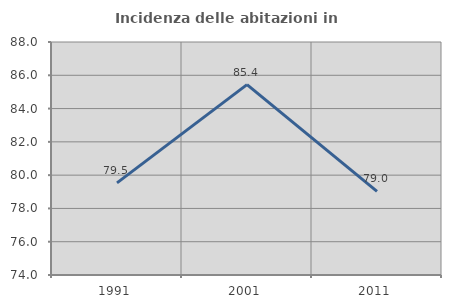
| Category | Incidenza delle abitazioni in proprietà  |
|---|---|
| 1991.0 | 79.538 |
| 2001.0 | 85.44 |
| 2011.0 | 79.023 |